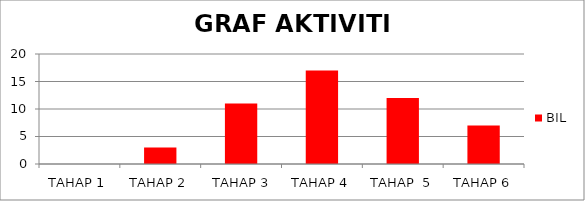
| Category | BIL |
|---|---|
| TAHAP 1 | 0 |
| TAHAP 2 | 3 |
|  TAHAP 3 | 11 |
| TAHAP 4 | 17 |
| TAHAP  5 | 12 |
| TAHAP 6 | 7 |